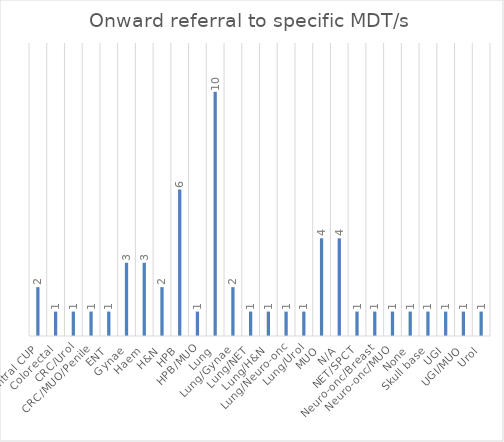
| Category | Series 0 |
|---|---|
| Central CUP | 2 |
| Colorectal | 1 |
| CRC/Urol | 1 |
| CRC/MUO/Penile | 1 |
| ENT | 1 |
| Gynae | 3 |
| Haem | 3 |
| H&N | 2 |
| HPB | 6 |
| HPB/MUO | 1 |
| Lung | 10 |
| Lung/Gynae | 2 |
| Lung/NET | 1 |
| Lung/H&N | 1 |
| Lung/Neuro-onc | 1 |
| Lung/Urol | 1 |
| MUO | 4 |
| N/A | 4 |
| NET/SPCT | 1 |
| Neuro-onc/Breast | 1 |
| Neuro-onc/MUO | 1 |
| None | 1 |
| Skull base | 1 |
| UGI | 1 |
| UGI/MUO | 1 |
| Urol | 1 |